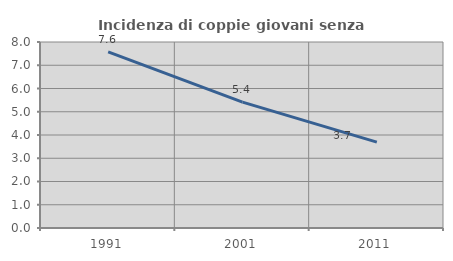
| Category | Incidenza di coppie giovani senza figli |
|---|---|
| 1991.0 | 7.577 |
| 2001.0 | 5.415 |
| 2011.0 | 3.693 |